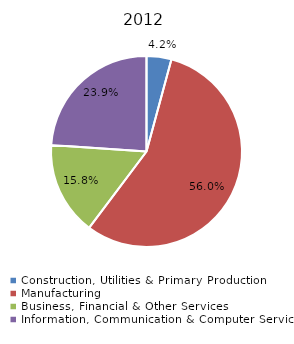
| Category | Series 0 |
|---|---|
| Construction, Utilities & Primary Production  | 0.042 |
| Manufacturing  | 0.56 |
| Business, Financial & Other Services | 0.158 |
| Information, Communication & Computer Services | 0.239 |